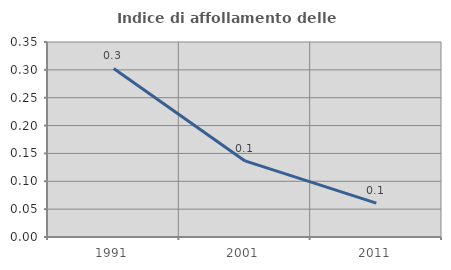
| Category | Indice di affollamento delle abitazioni  |
|---|---|
| 1991.0 | 0.303 |
| 2001.0 | 0.137 |
| 2011.0 | 0.061 |